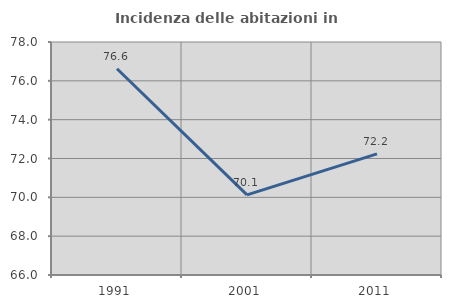
| Category | Incidenza delle abitazioni in proprietà  |
|---|---|
| 1991.0 | 76.623 |
| 2001.0 | 70.123 |
| 2011.0 | 72.236 |